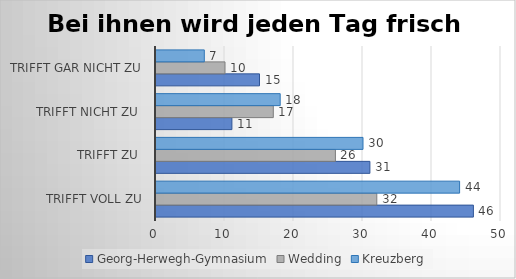
| Category | Georg-Herwegh-Gymnasium | Wedding | Kreuzberg |
|---|---|---|---|
| trifft voll zu | 46 | 32 | 44 |
| trifft zu  | 31 | 26 | 30 |
| trifft nicht zu  | 11 | 17 | 18 |
| trifft gar nicht zu | 15 | 10 | 7 |